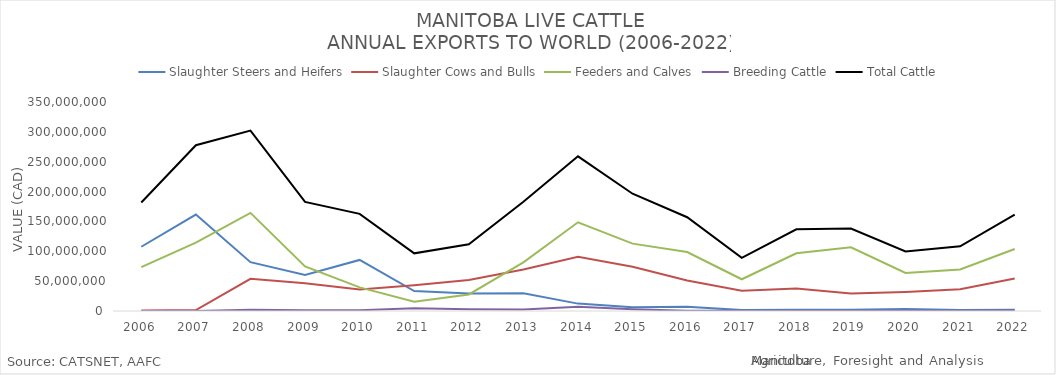
| Category | Slaughter Steers and Heifers | Slaughter Cows and Bulls | Feeders and Calves | Breeding Cattle | Total Cattle |
|---|---|---|---|---|---|
| 2006 | 107597923 | 725207 | 73339466 | 0 | 181662596 |
| 2007 | 161508887 | 1593027 | 114420860 | 46023 | 277568797 |
| 2008 | 81781537 | 53945224 | 164351094 | 2072364 | 302150219 |
| 2009 | 60302347 | 46466420 | 74743711 | 1263383 | 182775861 |
| 2010 | 85538277 | 36135913 | 39592738 | 1357369 | 162624297 |
| 2011 | 33357100 | 43185338 | 15369967 | 4644664 | 96557069 |
| 2012 | 29121198 | 52107606 | 27671417 | 2723584 | 111623805 |
| 2013 | 29673436 | 69508675 | 81377371 | 2361518 | 182921000 |
| 2014 | 12373165 | 90959541 | 148528093 | 7190631 | 259051430 |
| 2015 | 6443118 | 74009889 | 112828453 | 3127949 | 196409409 |
| 2016 | 6984426 | 51024566 | 98662583 | 369129 | 157040704 |
| 2017 | 1533527 | 34081637 | 53139099 | 348737 | 89103000 |
| 2018 | 2103694 | 37767216 | 96571847 | 318146 | 136760903 |
| 2019 | 1917411 | 29156634 | 106742455 | 211986 | 138028486 |
| 2020 | 3477533 | 31949114 | 63790917 | 570445 | 99788009 |
| 2021 | 1718970 | 36386077 | 69666875 | 470110 | 108242032 |
| 2022 | 2250707 | 54500235 | 103916947 | 853476 | 161521365 |